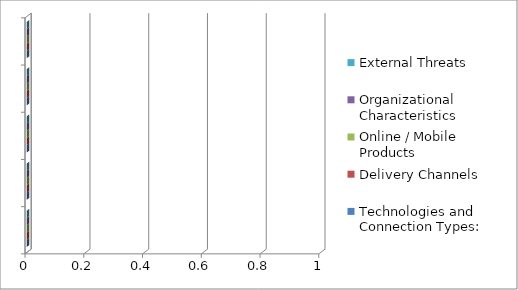
| Category | Technologies and Connection Types: | Delivery Channels | Online / Mobile Products  | Organizational Characteristics | External Threats |
|---|---|---|---|---|---|
|  | 0 | 0 | 0 | 0 | 0 |
|  | 0 | 0 | 0 | 0 | 0 |
|  | 0 | 0 | 0 | 0 | 0 |
|  | 0 | 0 | 0 | 0 | 0 |
|  | 0 | 0 | 0 | 0 | 0 |